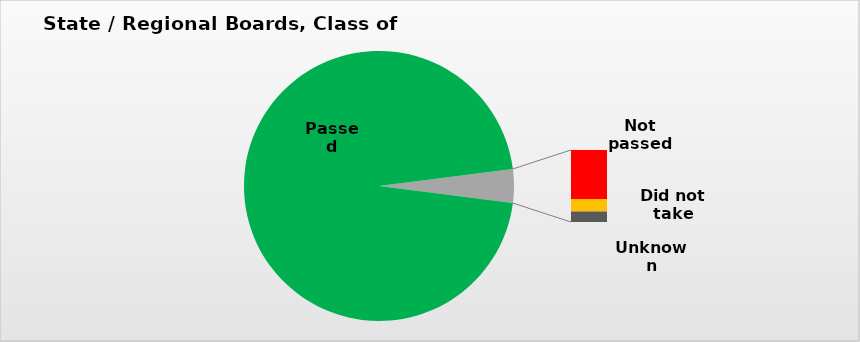
| Category | Series 0 |
|---|---|
| Passed | 0.96 |
| Not passed | 0.027 |
| Did not take | 0.007 |
| Unknown | 0.006 |